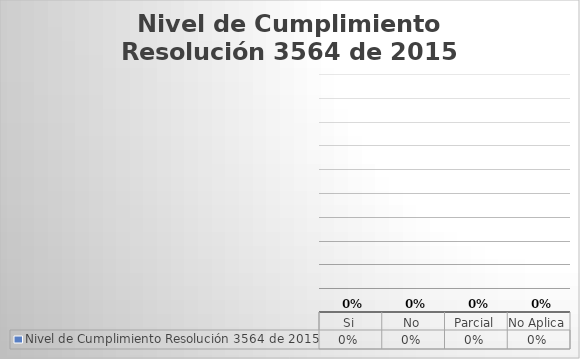
| Category | Nivel de Cumplimiento Resolución 3564 de 2015 |
|---|---|
| Si | 0 |
| No | 0 |
| Parcial | 0 |
| No Aplica | 0 |